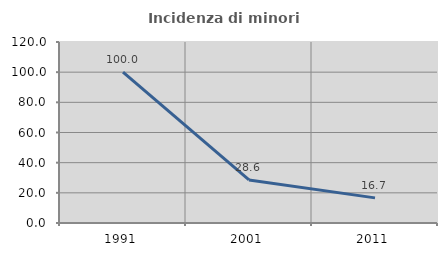
| Category | Incidenza di minori stranieri |
|---|---|
| 1991.0 | 100 |
| 2001.0 | 28.571 |
| 2011.0 | 16.667 |